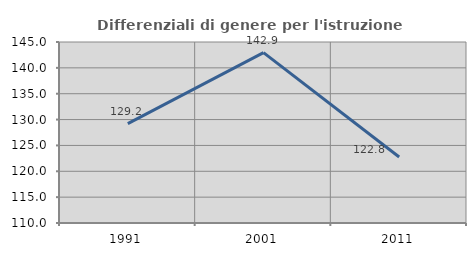
| Category | Differenziali di genere per l'istruzione superiore |
|---|---|
| 1991.0 | 129.214 |
| 2001.0 | 142.939 |
| 2011.0 | 122.763 |